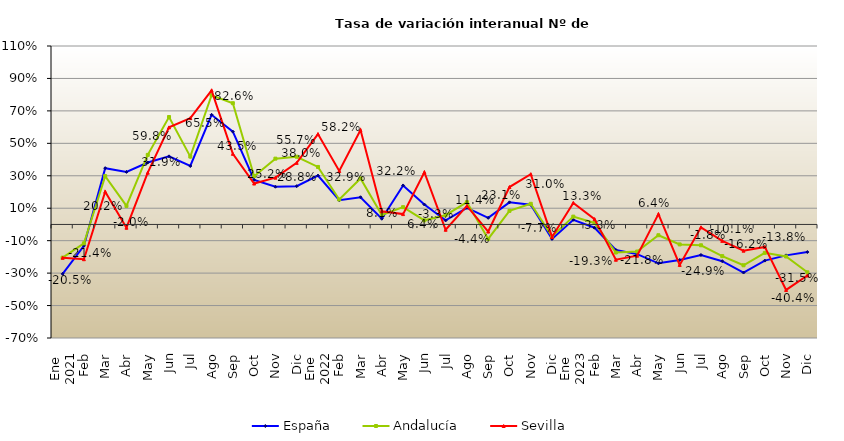
| Category | España | Andalucía | Sevilla |
|---|---|---|---|
| 0 | -0.305 | -0.205 | -0.205 |
| 1 | -0.132 | -0.116 | -0.214 |
| 2 | 0.347 | 0.298 | 0.202 |
| 3 | 0.324 | 0.114 | -0.02 |
| 4 | 0.382 | 0.429 | 0.319 |
| 5 | 0.42 | 0.662 | 0.598 |
| 6 | 0.36 | 0.418 | 0.655 |
| 7 | 0.676 | 0.796 | 0.826 |
| 8 | 0.572 | 0.747 | 0.435 |
| 9 | 0.275 | 0.297 | 0.252 |
| 10 | 0.232 | 0.406 | 0.288 |
| 11 | 0.236 | 0.417 | 0.38 |
| 12 | 0.301 | 0.354 | 0.557 |
| 13 | 0.149 | 0.154 | 0.329 |
| 14 | 0.168 | 0.284 | 0.582 |
| 15 | 0.035 | 0.058 | 0.081 |
| 16 | 0.24 | 0.107 | 0.064 |
| 17 | 0.123 | 0.025 | 0.322 |
| 18 | 0.025 | 0.057 | -0.033 |
| 19 | 0.102 | 0.137 | 0.114 |
| 20 | 0.041 | -0.089 | -0.044 |
| 21 | 0.136 | 0.084 | 0.231 |
| 22 | 0.121 | 0.127 | 0.31 |
| 23 | -0.089 | -0.074 | -0.077 |
| 24 | 0.029 | 0.048 | 0.133 |
| 25 | -0.02 | 0.009 | 0.033 |
| 26 | -0.157 | -0.173 | -0.218 |
| 27 | -0.183 | -0.167 | -0.193 |
| 28 | -0.24 | -0.067 | 0.064 |
| 29 | -0.219 | -0.123 | -0.249 |
| 30 | -0.188 | -0.128 | -0.018 |
| 31 | -0.227 | -0.195 | -0.101 |
| 32 | -0.296 | -0.252 | -0.162 |
| 33 | -0.223 | -0.175 | -0.138 |
| 34 | -0.191 | -0.198 | -0.404 |
| 35 | -0.17 | -0.295 | -0.315 |